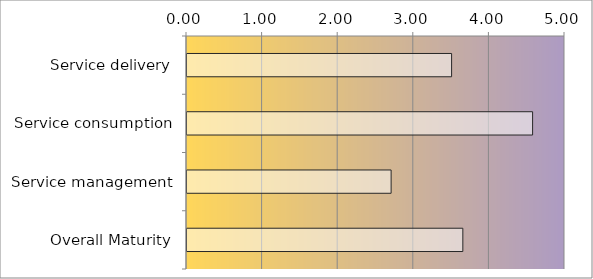
| Category | Series 0 |
|---|---|
| Service delivery | 3.5 |
| Service consumption | 4.571 |
| Service management | 2.7 |
| Overall Maturity | 3.649 |